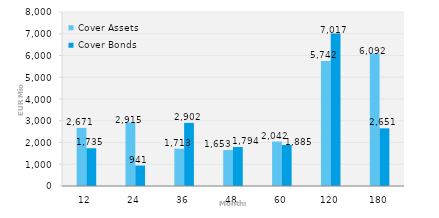
| Category | Cover Assets | Cover Bonds |
|---|---|---|
| 12.0 | 2670.702 | 1735.261 |
| 24.0 | 2914.622 | 940.709 |
| 36.0 | 1712.823 | 2902.228 |
| 48.0 | 1653.056 | 1794.487 |
| 60.0 | 2042.482 | 1885.025 |
| 120.0 | 5741.81 | 7016.809 |
| 180.0 | 6092 | 2650.819 |